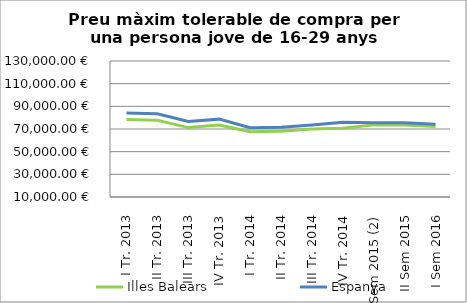
| Category | Illes Balears | Espanya |
|---|---|---|
| I Tr. 2013 | 78277.67 | 84010.43 |
| II Tr. 2013 | 77684.25 | 83373.55 |
| III Tr. 2013 | 71233.5 | 76683.49 |
| IV Tr. 2013 | 73540.56 | 78704.57 |
| I Tr. 2014 | 67624.25 | 71141.42 |
| II Tr. 2014 | 67911.27 | 71503.84 |
| III Tr. 2014 | 70011.39 | 73589.29 |
| IV Tr. 2014 | 70737.24 | 75989.64 |
| I Sem 2015 (2) | 73636.12 | 75563.82 |
| II Sem 2015 | 73601.1 | 75602.04 |
| I Sem 2016 | 72117.81 | 74146.29 |